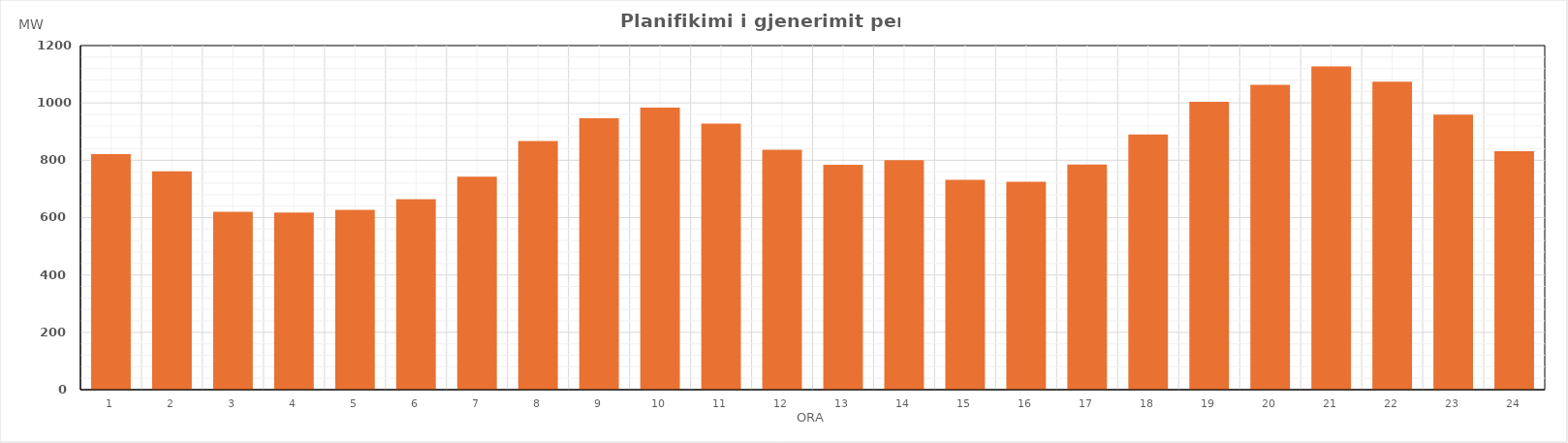
| Category | Max (MW) |
|---|---|
| 0 | 821.25 |
| 1 | 761.33 |
| 2 | 619.89 |
| 3 | 617.37 |
| 4 | 627.17 |
| 5 | 663.86 |
| 6 | 742.67 |
| 7 | 866.76 |
| 8 | 946.31 |
| 9 | 983.32 |
| 10 | 928.02 |
| 11 | 836.67 |
| 12 | 783.94 |
| 13 | 799.95 |
| 14 | 731.45 |
| 15 | 724.82 |
| 16 | 785.12 |
| 17 | 890.25 |
| 18 | 1003.71 |
| 19 | 1063.24 |
| 20 | 1127.34 |
| 21 | 1073.86 |
| 22 | 958.89 |
| 23 | 831.29 |